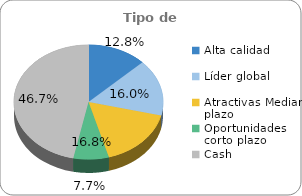
| Category | Series 0 |
|---|---|
| Alta calidad | 0.128 |
| Líder global | 0.16 |
| Atractivas Mediano plazo | 0.168 |
| Oportunidades corto plazo | 0.077 |
| Cash | 0.467 |